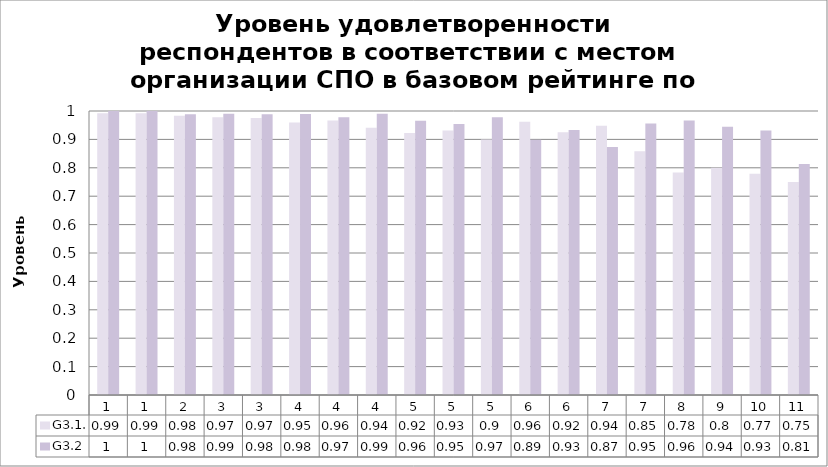
| Category | G3.1. | G3.2 |
|---|---|---|
| 1.0 | 0.992 | 1 |
| 1.0 | 0.992 | 1 |
| 2.0 | 0.983 | 0.989 |
| 3.0 | 0.978 | 0.99 |
| 3.0 | 0.975 | 0.989 |
| 4.0 | 0.96 | 0.989 |
| 4.0 | 0.967 | 0.978 |
| 4.0 | 0.941 | 0.99 |
| 5.0 | 0.922 | 0.966 |
| 5.0 | 0.931 | 0.954 |
| 5.0 | 0.9 | 0.978 |
| 6.0 | 0.962 | 0.899 |
| 6.0 | 0.925 | 0.933 |
| 7.0 | 0.948 | 0.874 |
| 7.0 | 0.858 | 0.956 |
| 8.0 | 0.783 | 0.967 |
| 9.0 | 0.8 | 0.944 |
| 10.0 | 0.779 | 0.931 |
| 11.0 | 0.75 | 0.814 |